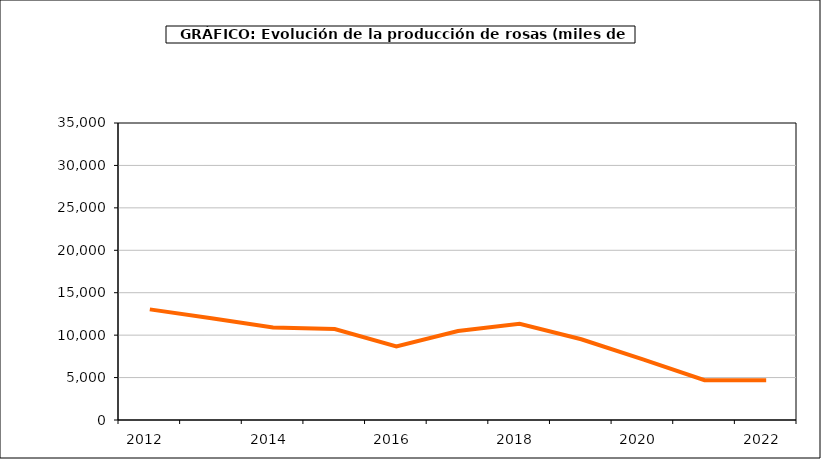
| Category | producción |
|---|---|
| 2012.0 | 13038 |
| 2013.0 | 11993 |
| 2014.0 | 10897 |
| 2015.0 | 10725 |
| 2016.0 | 8682 |
| 2017.0 | 10480 |
| 2018.0 | 11340 |
| 2019.0 | 9513 |
| 2020.0 | 7135 |
| 2021.0 | 4689 |
| 2022.0 | 4688 |